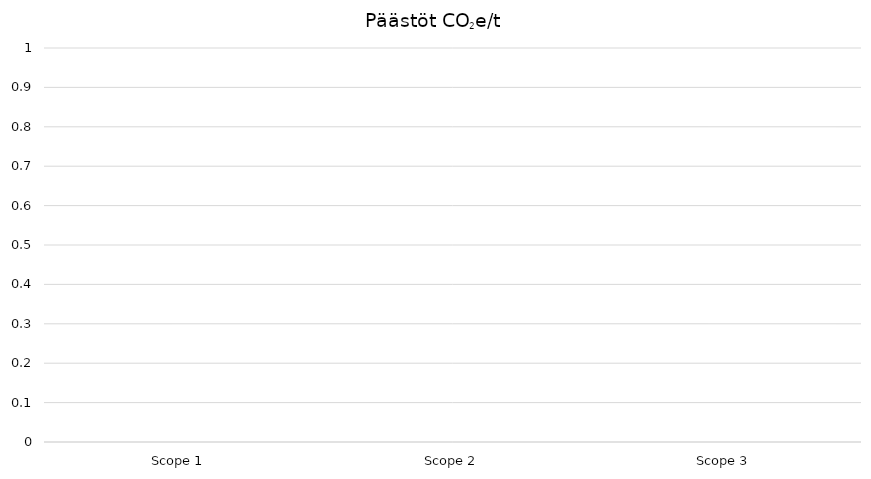
| Category | CO2e/t |
|---|---|
| Scope 1 | 0 |
| Scope 2 | 0 |
| Scope 3 | 0 |